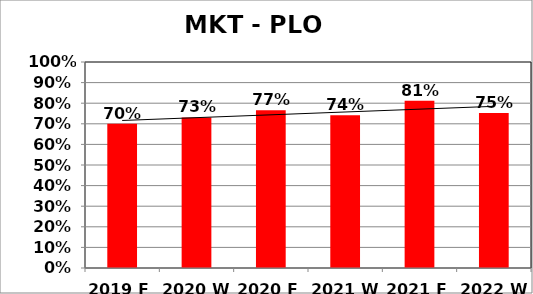
| Category | Series 0 |
|---|---|
| 2019 F | 0.7 |
| 2020 W | 0.731 |
| 2020 F | 0.766 |
| 2021 W | 0.742 |
| 2021 F | 0.812 |
| 2022 W | 0.752 |